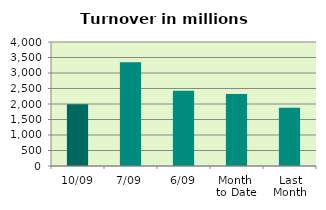
| Category | Series 0 |
|---|---|
| 10/09 | 1994.414 |
| 7/09 | 3350.076 |
| 6/09 | 2426.512 |
| Month 
to Date | 2322.71 |
| Last
Month | 1877.423 |